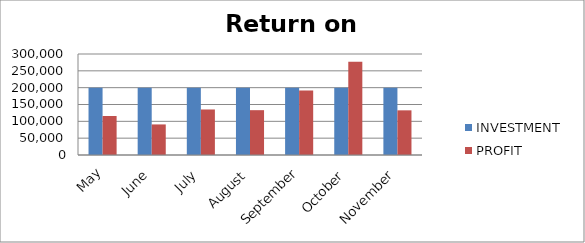
| Category | INVESTMENT  | PROFIT |
|---|---|---|
| May | 200000 | 115878 |
| June | 200000 | 90800 |
| July | 200000 | 135218 |
| August | 200000 | 133151 |
| September | 200000 | 191545 |
| October | 200000 | 276993 |
| November | 200000 | 132667 |